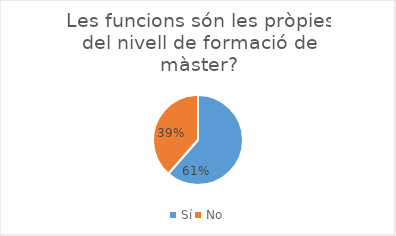
| Category | Series 0 |
|---|---|
| Sí | 67 |
| No | 42 |